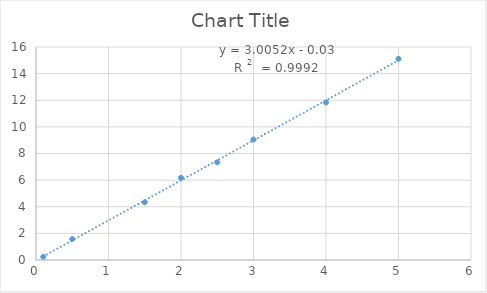
| Category | Series 0 |
|---|---|
| 0.1 | 0.237 |
| 0.5 | 1.577 |
| 1.5 | 4.336 |
| 2.0 | 6.179 |
| 2.5 | 7.336 |
| 3.0 | 9.046 |
| 4.0 | 11.835 |
| 5.0 | 15.112 |